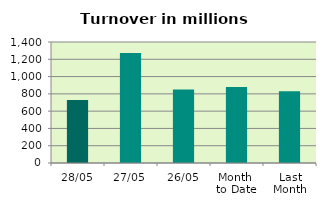
| Category | Series 0 |
|---|---|
| 28/05 | 727.614 |
| 27/05 | 1273.489 |
| 26/05 | 851.492 |
| Month 
to Date | 878.104 |
| Last
Month | 829.993 |